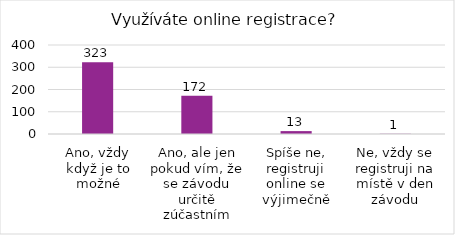
| Category | Series 0 |
|---|---|
| Ano, vždy když je to možné | 323 |
| Ano, ale jen pokud vím, že se závodu určitě zúčastním | 172 |
| Spíše ne, registruji online se výjimečně | 13 |
| Ne, vždy se registruji na místě v den závodu | 1 |